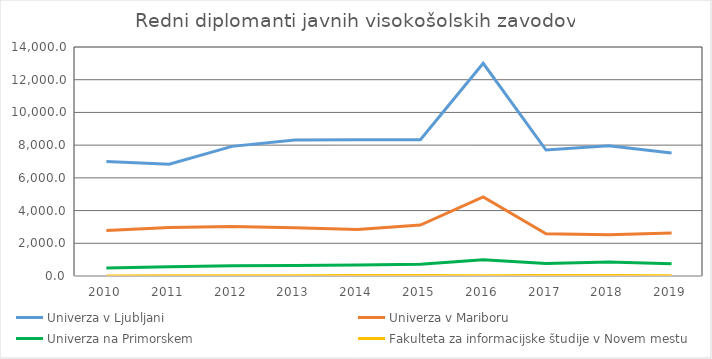
| Category | Univerza v Ljubljani | Univerza v Mariboru | Univerza na Primorskem | Fakulteta za informacijske študije v Novem mestu |
|---|---|---|---|---|
| 2010.0 | 7007 | 2787 | 487 | 5 |
| 2011.0 | 6831.5 | 2963 | 559 | 11 |
| 2012.0 | 7925 | 3031 | 632 | 19 |
| 2013.0 | 8314 | 2948.5 | 638 | 17 |
| 2014.0 | 8329 | 2835.5 | 668 | 27 |
| 2015.0 | 8337 | 3115 | 724 | 33 |
| 2016.0 | 13005.5 | 4831.5 | 993 | 15 |
| 2017.0 | 7701.5 | 2581.5 | 770.5 | 29 |
| 2018.0 | 7963 | 2528.5 | 862 | 26 |
| 2019.0 | 7515.5 | 2622 | 750 | 17 |